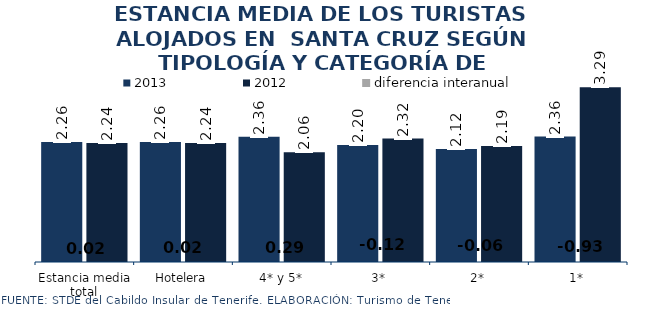
| Category | 2013 | 2012 |
|---|---|---|
| Estancia media total | 2.259 | 2.239 |
| Hotelera | 2.259 | 2.239 |
| 4* y 5* | 2.355 | 2.063 |
| 3* | 2.202 | 2.322 |
| 2* | 2.124 | 2.185 |
| 1* | 2.36 | 3.289 |